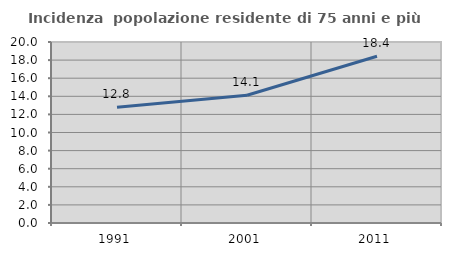
| Category | Incidenza  popolazione residente di 75 anni e più |
|---|---|
| 1991.0 | 12.799 |
| 2001.0 | 14.122 |
| 2011.0 | 18.421 |